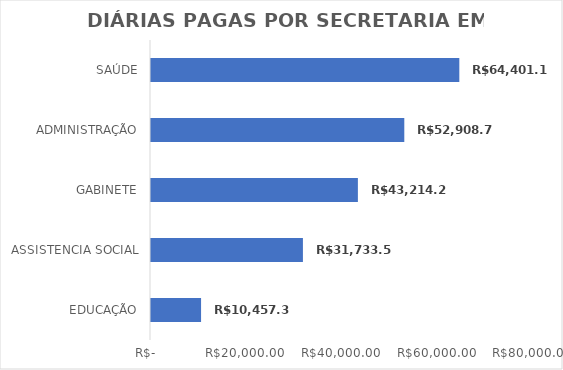
| Category | Total |
|---|---|
| EDUCAÇÃO | 10457.38 |
| ASSISTENCIA SOCIAL | 31733.57 |
| GABINETE | 43214.28 |
| ADMINISTRAÇÃO | 52908.75 |
| SAÚDE | 64401.16 |